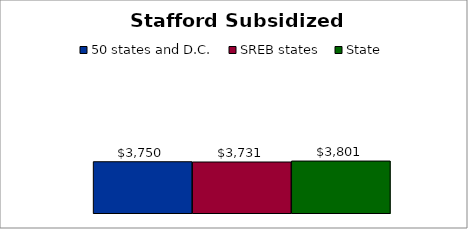
| Category | 50 states and D.C. | SREB states | State |
|---|---|---|---|
| 0 | 3750.402 | 3731.345 | 3801.224 |